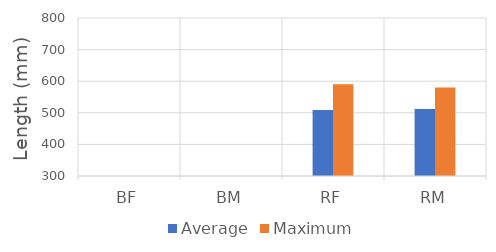
| Category | Average | Maximum |
|---|---|---|
| BF | 0 | 0 |
| BM | 0 | 0 |
| RF | 509 | 590 |
| RM | 512 | 580 |